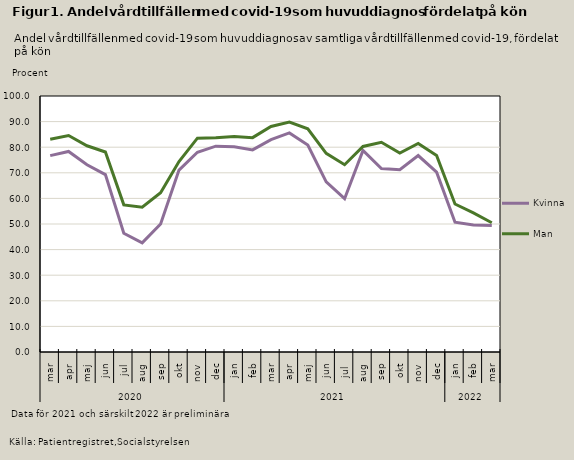
| Category | Kvinna | Man |
|---|---|---|
| 0 | 76.716 | 83.097 |
| 1 | 78.33 | 84.555 |
| 2 | 73.145 | 80.564 |
| 3 | 69.304 | 78.133 |
| 4 | 46.392 | 57.474 |
| 5 | 42.611 | 56.548 |
| 6 | 50 | 62.233 |
| 7 | 71.05 | 74.417 |
| 8 | 78.037 | 83.541 |
| 9 | 80.407 | 83.669 |
| 10 | 80.183 | 84.194 |
| 11 | 78.955 | 83.739 |
| 12 | 82.965 | 88.117 |
| 13 | 85.568 | 89.808 |
| 14 | 80.865 | 87.18 |
| 15 | 66.447 | 77.623 |
| 16 | 59.88 | 73.16 |
| 17 | 78.764 | 80.289 |
| 18 | 71.658 | 81.916 |
| 19 | 71.223 | 77.737 |
| 20 | 76.736 | 81.432 |
| 21 | 70.239 | 76.759 |
| 22 | 50.721 | 57.802 |
| 23 | 49.656 | 54.312 |
| 24 | 49.459 | 50.468 |